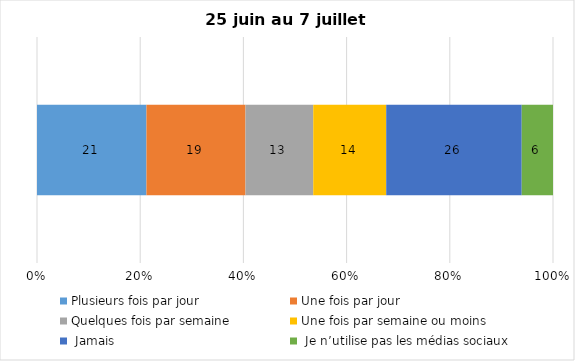
| Category | Plusieurs fois par jour | Une fois par jour | Quelques fois par semaine   | Une fois par semaine ou moins   |  Jamais   |  Je n’utilise pas les médias sociaux |
|---|---|---|---|---|---|---|
| 0 | 21 | 19 | 13 | 14 | 26 | 6 |